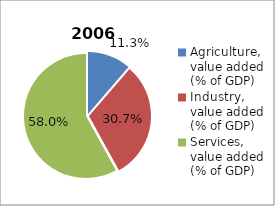
| Category | 2006 |
|---|---|
| Agriculture, value added (% of GDP)  | 11.339 |
| Industry, value added (% of GDP) | 30.65 |
| Services, value added (% of GDP) | 58.011 |